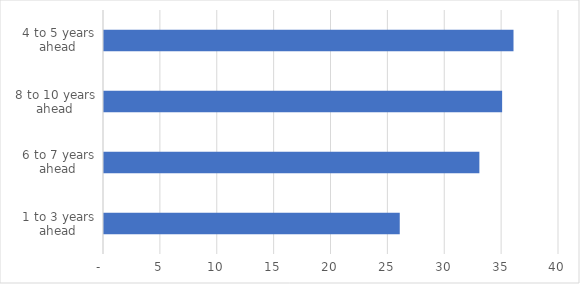
| Category | Priority score (highest = high priority) |
|---|---|
| 1 to 3 years ahead | 26 |
| 6 to 7 years ahead | 33 |
| 8 to 10 years ahead | 35 |
| 4 to 5 years ahead | 36 |